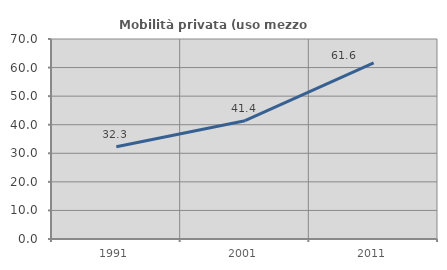
| Category | Mobilità privata (uso mezzo privato) |
|---|---|
| 1991.0 | 32.278 |
| 2001.0 | 41.406 |
| 2011.0 | 61.607 |